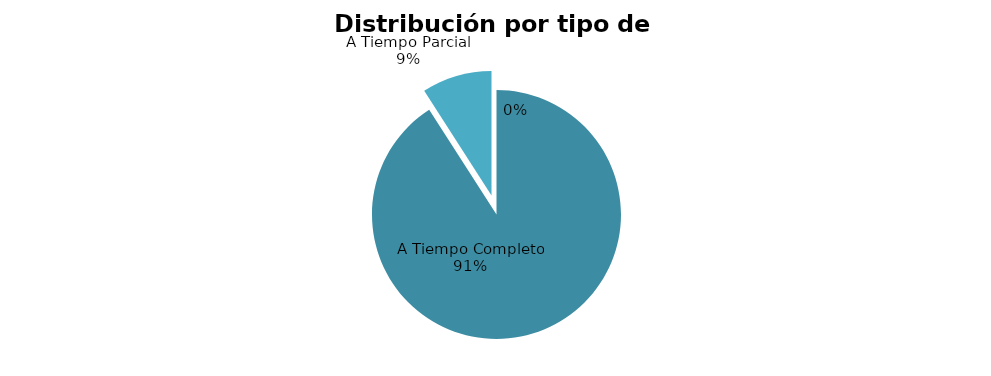
| Category | 10 |
|---|---|
| A Tiempo Completo | 10 |
| A Tiempo Parcial | 1 |